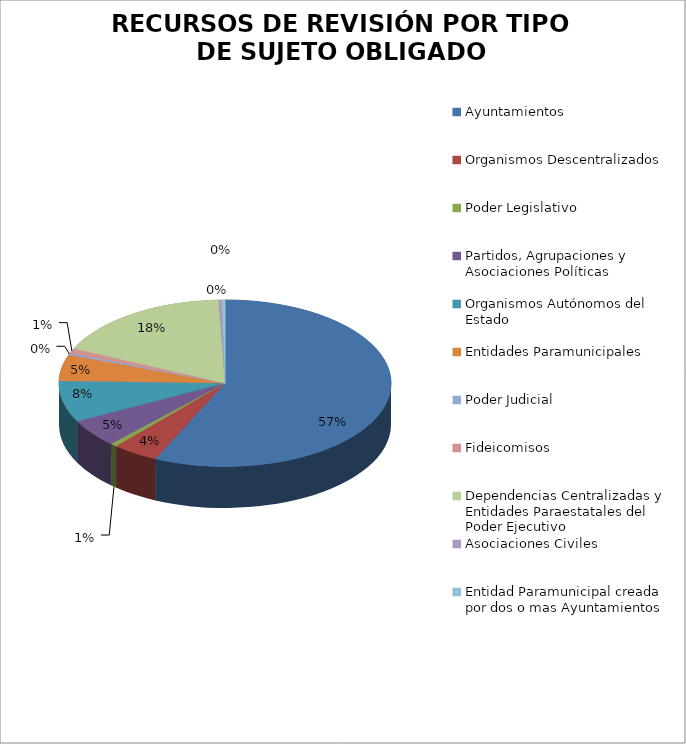
| Category | Series 0 |
|---|---|
| Ayuntamientos | 178 |
| Organismos Descentralizados | 14 |
| Poder Legislativo | 2 |
| Partidos, Agrupaciones y Asociaciones Políticas | 17 |
| Organismos Autónomos del Estado | 25 |
| Entidades Paramunicipales | 16 |
| Poder Judicial | 1 |
| Fideicomisos | 3 |
| Dependencias Centralizadas y Entidades Paraestatales del Poder Ejecutivo | 55 |
| Asociaciones Civiles | 1 |
| Entidad Paramunicipal creada por dos o mas Ayuntamientos | 1 |